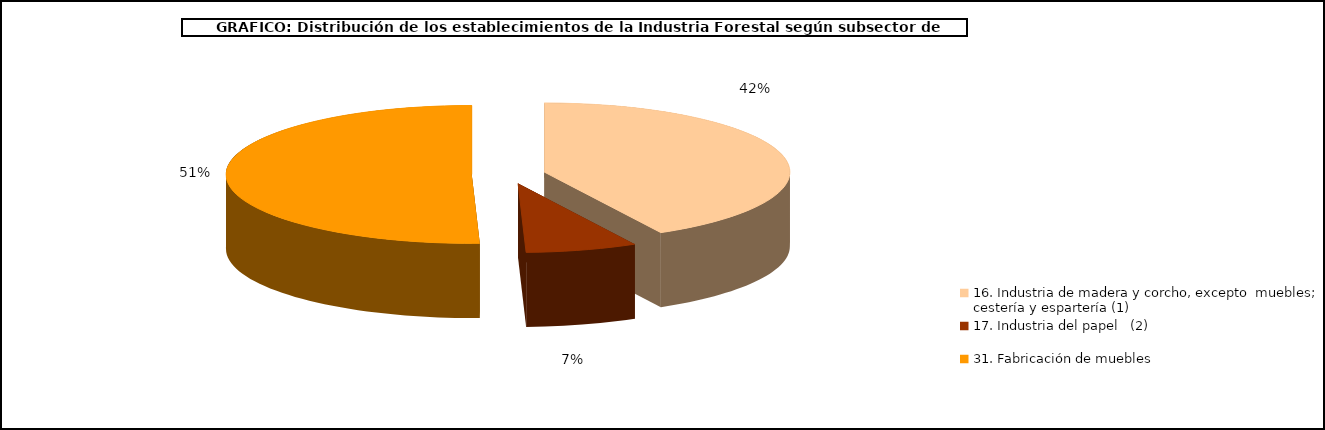
| Category | Series 0 |
|---|---|
| 16. Industria de madera y corcho, excepto  muebles; cestería y espartería (1) | 42.122 |
| 17. Industria del papel   (2) | 7.355 |
| 31. Fabricación de muebles  | 50.523 |